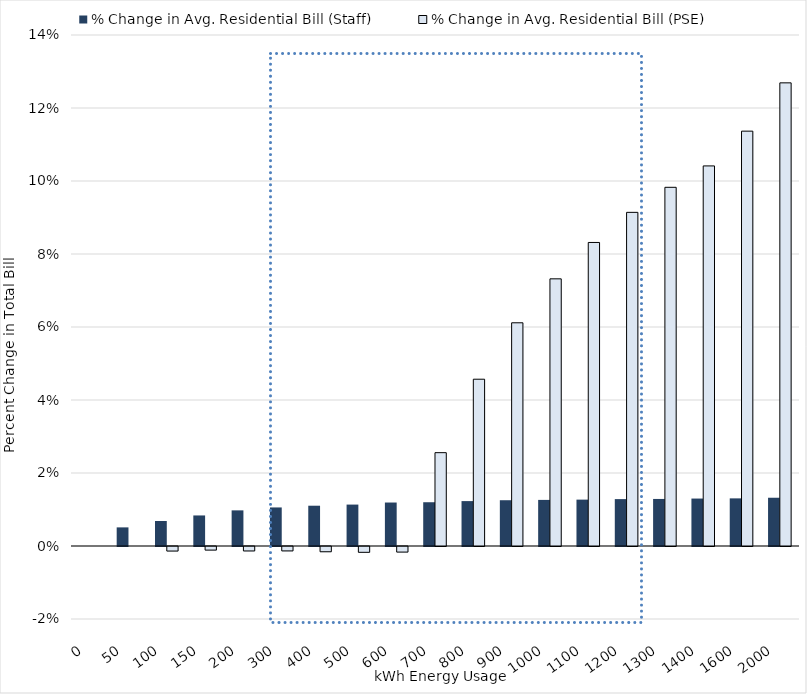
| Category | % Change in Avg. Residential Bill (Staff) | % Change in Avg. Residential Bill (PSE) |
|---|---|---|
| 0.0 | 0 | 0 |
| 50.0 | 0.005 | 0 |
| 100.0 | 0.007 | -0.001 |
| 150.0 | 0.008 | -0.001 |
| 200.0 | 0.01 | -0.001 |
| 300.0 | 0.011 | -0.001 |
| 400.0 | 0.011 | -0.001 |
| 500.0 | 0.011 | -0.002 |
| 600.0 | 0.012 | -0.002 |
| 700.0 | 0.012 | 0.026 |
| 800.0 | 0.012 | 0.046 |
| 900.0 | 0.013 | 0.061 |
| 1000.0 | 0.013 | 0.073 |
| 1100.0 | 0.013 | 0.083 |
| 1200.0 | 0.013 | 0.091 |
| 1300.0 | 0.013 | 0.098 |
| 1400.0 | 0.013 | 0.104 |
| 1600.0 | 0.013 | 0.114 |
| 2000.0 | 0.013 | 0.127 |